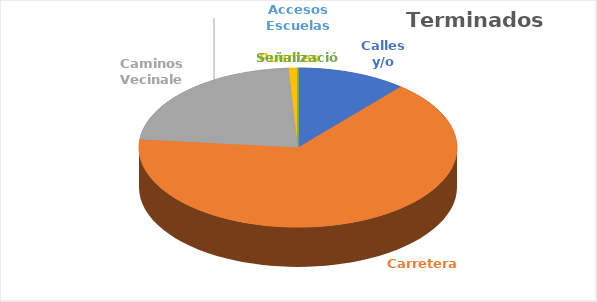
| Category | Terminados (kms) |
|---|---|
| Calles y/o Avenidas | 40.66 |
| Carreteras | 238.51 |
| Caminos Vecinales | 81.92 |
| Puentes  | 3.43 |
| Accesos Escuelas | 0 |
| Señalización | 0 |